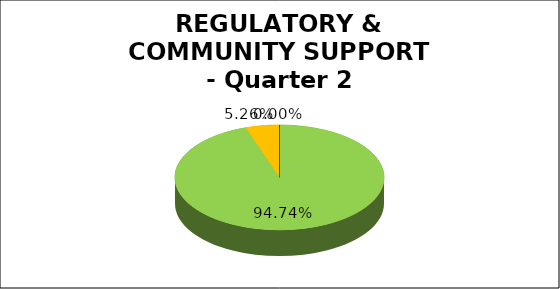
| Category | Q2 |
|---|---|
| Green | 0.947 |
| Amber | 0.053 |
| Red | 0 |